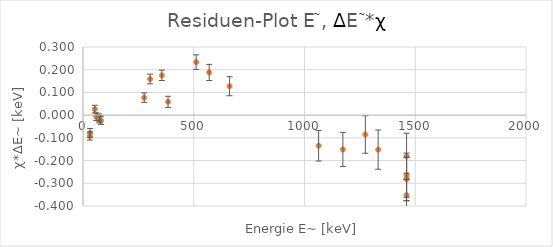
| Category | Series 1 |
|---|---|
| 32.1 | -0.078 |
| 661.7 | 0.127 |
| 1460.8 | -0.281 |
| 1173.24 | -0.151 |
| 1332.5 | -0.152 |
| 1460.8 | -0.281 |
| 59.54 | -0.006 |
| 511.0 | 0.233 |
| 1274.6 | -0.085 |
| 1460.8 | -0.264 |
| 72.8 | -0.012 |
| 74.97 | -0.018 |
| 569.7 | 0.188 |
| 1063.7 | -0.135 |
| 1460.8 | -0.352 |
| 30.9 | -0.092 |
| 53.12 | 0.026 |
| 81.0 | -0.023 |
| 276.397 | 0.077 |
| 302.851 | 0.159 |
| 356.005 | 0.175 |
| 383.851 | 0.059 |
| 1460.8 | -0.181 |